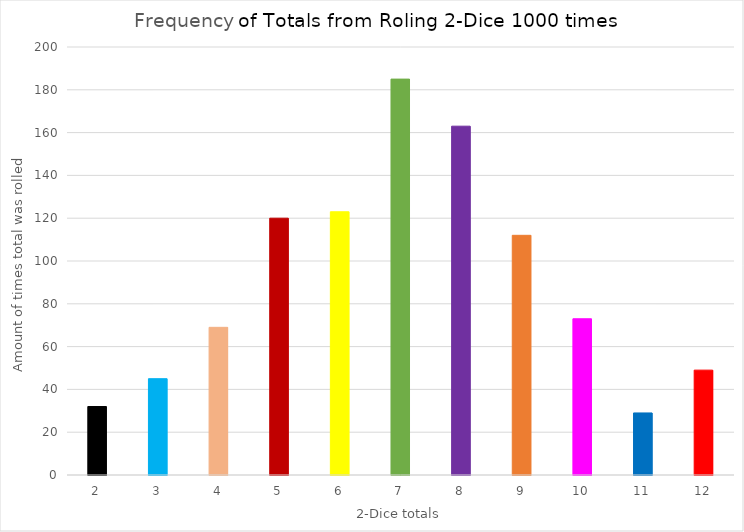
| Category | Frequency |
|---|---|
| 2.0 | 32 |
| 3.0 | 45 |
| 4.0 | 69 |
| 5.0 | 120 |
| 6.0 | 123 |
| 7.0 | 185 |
| 8.0 | 163 |
| 9.0 | 112 |
| 10.0 | 73 |
| 11.0 | 29 |
| 12.0 | 49 |